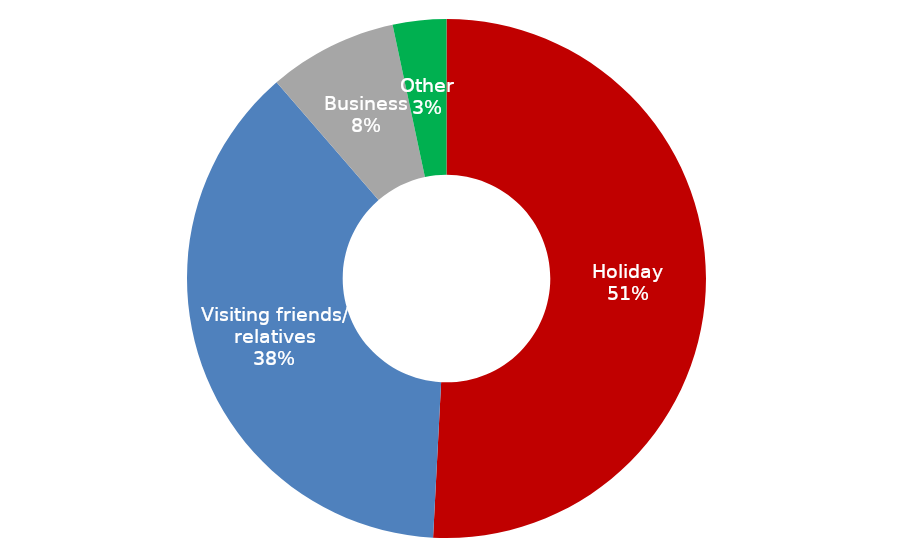
| Category | January - December 2017 |
|---|---|
| Holiday | 2465651.985 |
| Visiting friends/ relatives | 1834491.705 |
| Business | 389496.578 |
| Other | 161674.949 |